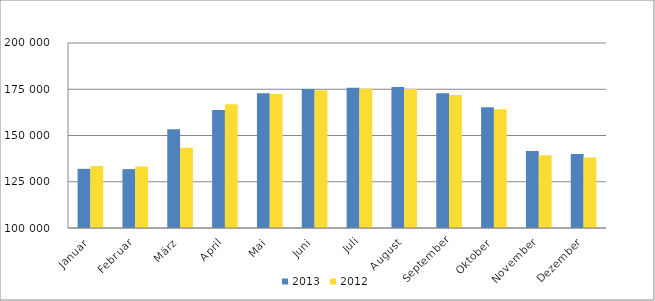
| Category | 2013 | 2012 |
|---|---|---|
| Januar | 131991 | 133496 |
| Februar | 131825 | 133242 |
| März | 153347 | 143436 |
| April | 163785 | 166951 |
| Mai | 172791 | 172412 |
| Juni | 175081 | 174453 |
| Juli | 175765 | 175230 |
| August | 176223 | 175096 |
| September | 172821 | 171883 |
| Oktober | 165302 | 164130 |
| November | 141630 | 139277 |
| Dezember | 140040 | 138128 |